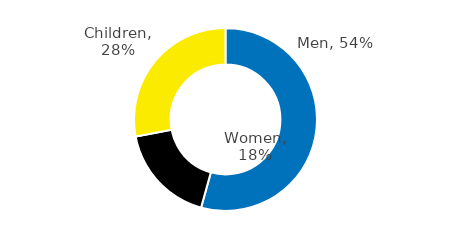
| Category | Series 0 |
|---|---|
| Men | 0.543 |
| Women | 0.177 |
| Children | 0.28 |